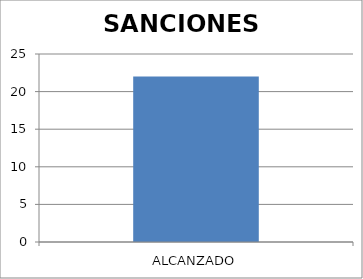
| Category | SANCIONES IMPUESTAS |
|---|---|
| ALCANZADO | 22 |